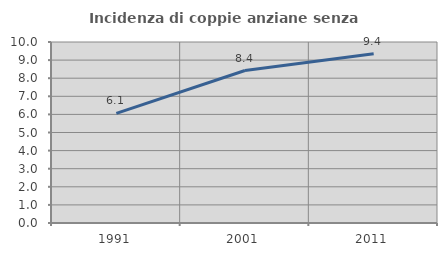
| Category | Incidenza di coppie anziane senza figli  |
|---|---|
| 1991.0 | 6.061 |
| 2001.0 | 8.424 |
| 2011.0 | 9.351 |